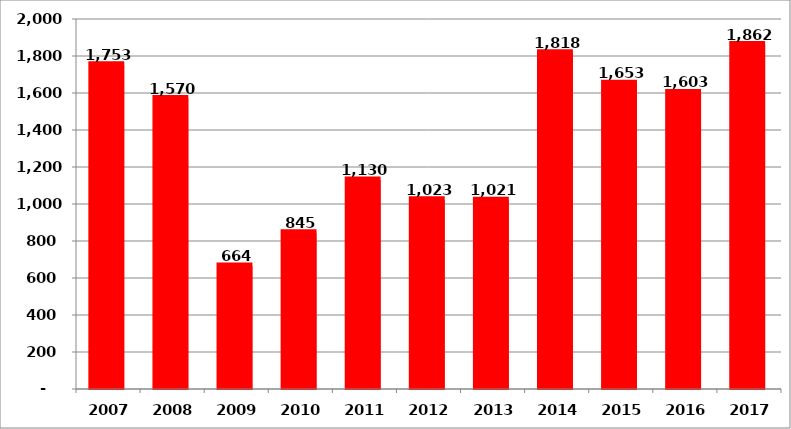
| Category | სულ |
|---|---|
| 2007.0 | 1752.646 |
| 2008.0 | 1569.723 |
| 2009.0 | 664.191 |
| 2010.0 | 845.114 |
| 2011.0 | 1130.263 |
| 2012.0 | 1022.928 |
| 2013.0 | 1020.634 |
| 2014.0 | 1817.981 |
| 2015.0 | 1652.508 |
| 2016.0 | 1602.851 |
| 2017.0 | 1861.901 |